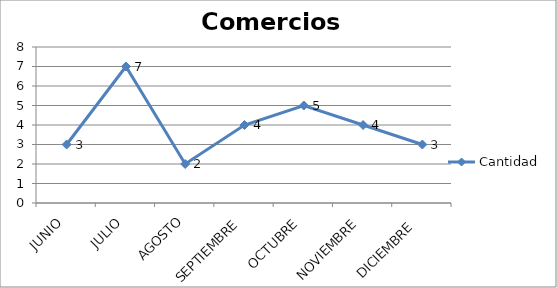
| Category | Cantidad |
|---|---|
| JUNIO | 3 |
| JULIO | 7 |
| AGOSTO | 2 |
| SEPTIEMBRE | 4 |
| OCTUBRE | 5 |
| NOVIEMBRE | 4 |
| DICIEMBRE  | 3 |